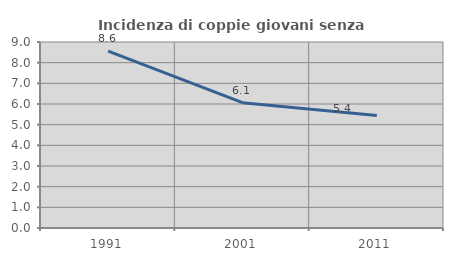
| Category | Incidenza di coppie giovani senza figli |
|---|---|
| 1991.0 | 8.558 |
| 2001.0 | 6.065 |
| 2011.0 | 5.439 |